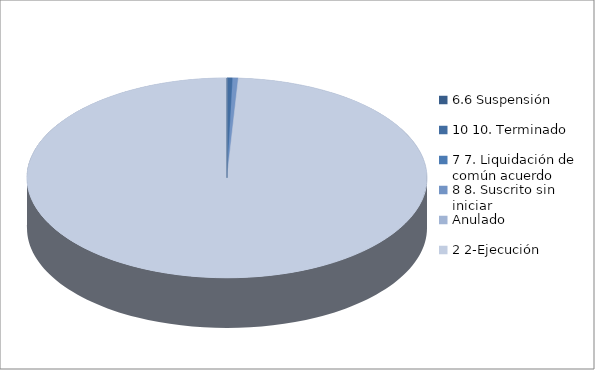
| Category | Series 0 |
|---|---|
| 6.6 Suspensión | 0 |
| 10 10. Terminado | 1 |
| 7 7. Liquidación de común acuerdo | 0 |
| 8 8. Suscrito sin iniciar | 1 |
| Anulado | 0 |
| 2 2-Ejecución | 219 |